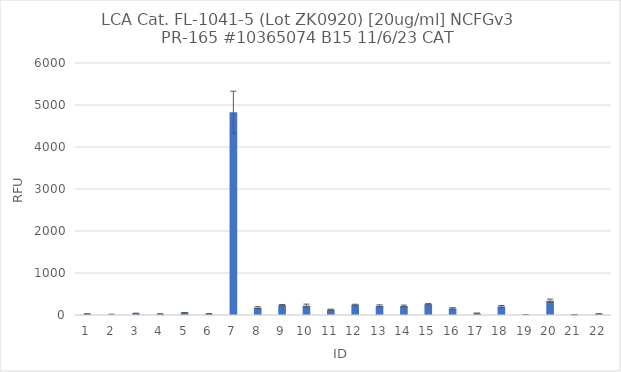
| Category | RFU |
|---|---|
| 0 | 26 |
| 1 | 5.75 |
| 2 | 39 |
| 3 | 20 |
| 4 | 57 |
| 5 | 22.75 |
| 6 | 4828 |
| 7 | 174 |
| 8 | 234.75 |
| 9 | 221.25 |
| 10 | 126.5 |
| 11 | 243.75 |
| 12 | 217.75 |
| 13 | 214.25 |
| 14 | 257 |
| 15 | 156 |
| 16 | 36.5 |
| 17 | 203 |
| 18 | 4 |
| 19 | 339.5 |
| 20 | 6 |
| 21 | 25 |